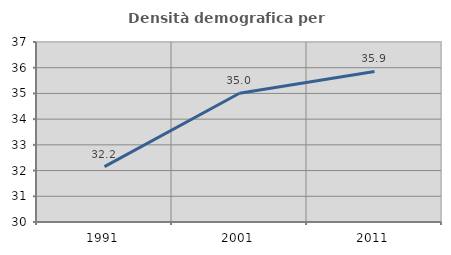
| Category | Densità demografica |
|---|---|
| 1991.0 | 32.151 |
| 2001.0 | 35.007 |
| 2011.0 | 35.856 |